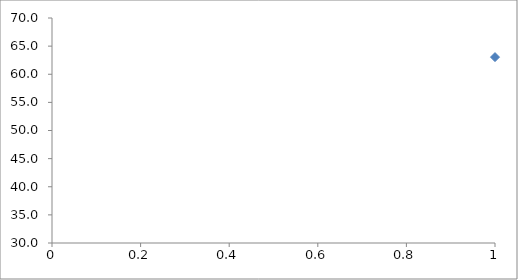
| Category | Series 0 |
|---|---|
| 0 | 63.048 |
| 1 | 65.96 |
| 2 | 62.286 |
| 3 | 53.75 |
| 4 | 66 |
| 5 | 64 |
| 6 | 65.286 |
| 7 | 48.25 |
| 8 | 48.667 |
| 9 | 64.619 |